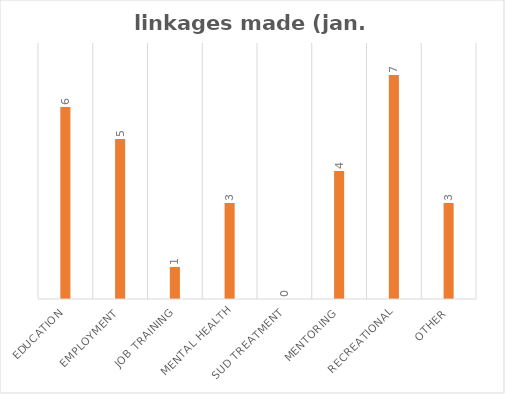
| Category | Series 0 |
|---|---|
| Education | 6 |
| Employment | 5 |
| Job Training | 1 |
| Mental Health | 3 |
| SUD Treatment | 0 |
| Mentoring | 4 |
| Recreational | 7 |
| Other | 3 |